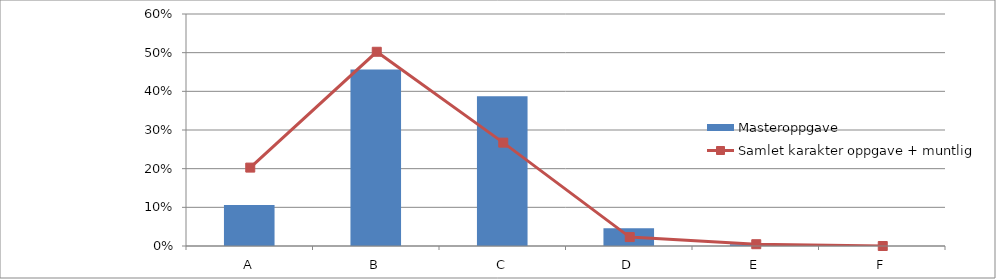
| Category | Masteroppgave |
|---|---|
| A | 0.106 |
| B | 0.456 |
| C | 0.387 |
| D | 0.046 |
| E | 0.005 |
| F | 0 |